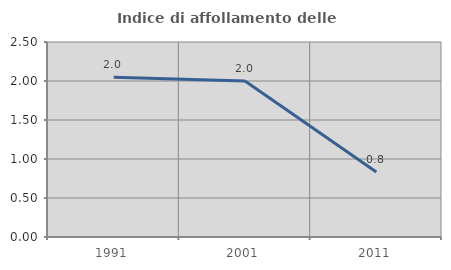
| Category | Indice di affollamento delle abitazioni  |
|---|---|
| 1991.0 | 2.05 |
| 2001.0 | 1.999 |
| 2011.0 | 0.833 |